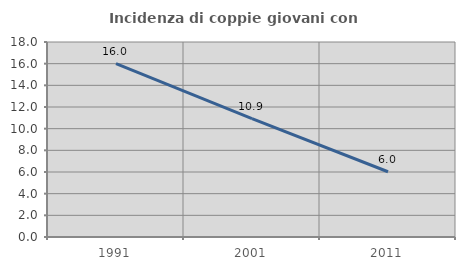
| Category | Incidenza di coppie giovani con figli |
|---|---|
| 1991.0 | 16 |
| 2001.0 | 10.93 |
| 2011.0 | 6.021 |